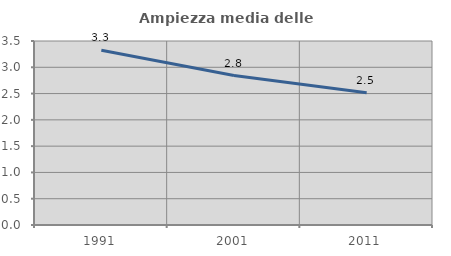
| Category | Ampiezza media delle famiglie |
|---|---|
| 1991.0 | 3.326 |
| 2001.0 | 2.843 |
| 2011.0 | 2.517 |